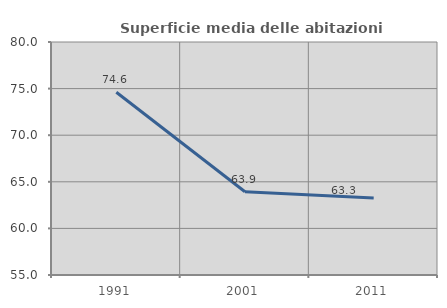
| Category | Superficie media delle abitazioni occupate |
|---|---|
| 1991.0 | 74.612 |
| 2001.0 | 63.937 |
| 2011.0 | 63.259 |